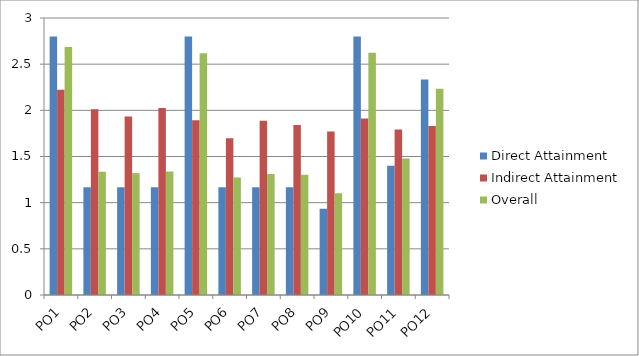
| Category | Direct Attainment | Indirect Attainment | Overall |
|---|---|---|---|
| PO1 | 2.8 | 2.224 | 2.685 |
| PO2 | 1.167 | 2.011 | 1.336 |
| PO3 | 1.167 | 1.933 | 1.32 |
| PO4 | 1.167 | 2.025 | 1.338 |
| PO5 | 2.8 | 1.894 | 2.619 |
| PO6 | 1.167 | 1.698 | 1.273 |
| PO7 | 1.167 | 1.887 | 1.311 |
| PO8 | 1.167 | 1.842 | 1.302 |
| PO9 | 0.933 | 1.772 | 1.101 |
| PO10 | 2.8 | 1.913 | 2.623 |
| PO11 | 1.4 | 1.792 | 1.478 |
| PO12 | 2.333 | 1.832 | 2.233 |